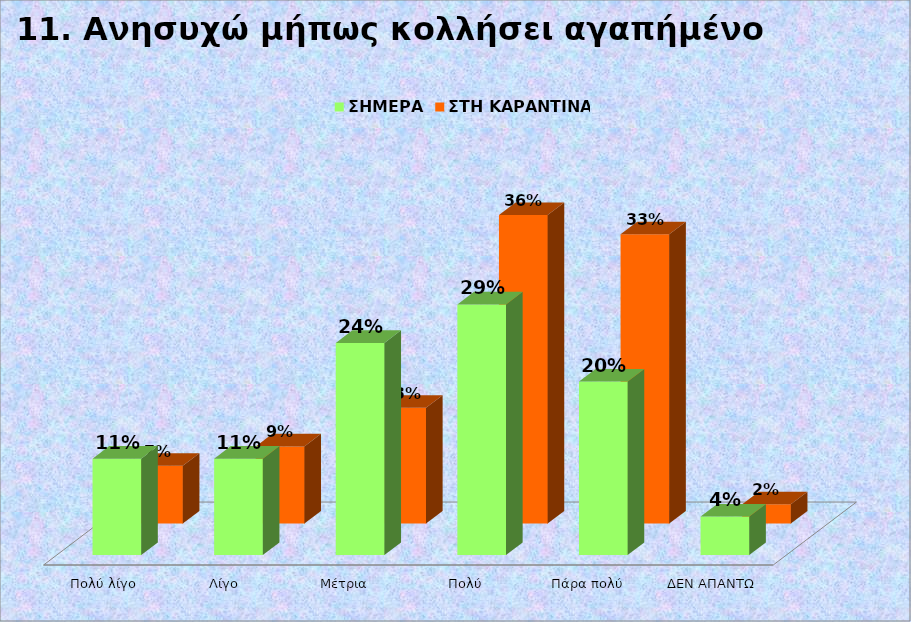
| Category | Series 0 | ΣΗΜΕΡΑ  | ΣΤΗ ΚΑΡΑΝΤΙΝΑ |
|---|---|---|---|
| Πολύ λίγο |  | 0.111 | 0.067 |
| Λίγο |  | 0.111 | 0.089 |
| Μέτρια  |  | 0.244 | 0.133 |
| Πολύ  |  | 0.289 | 0.356 |
| Πάρα πολύ  |  | 0.2 | 0.333 |
| ΔΕΝ ΑΠΑΝΤΩ |  | 0.044 | 0.022 |